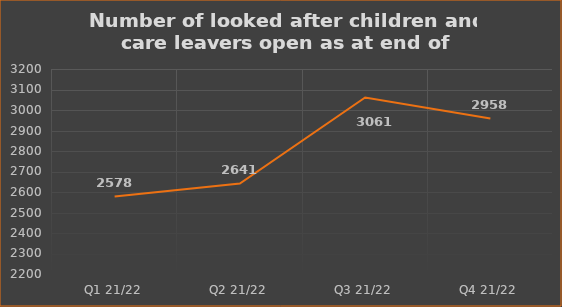
| Category | Number of open cases  |
|---|---|
| Q1 21/22 | 2578 |
| Q2 21/22 | 2641 |
| Q3 21/22 | 3061 |
| Q4 21/22 | 2958 |